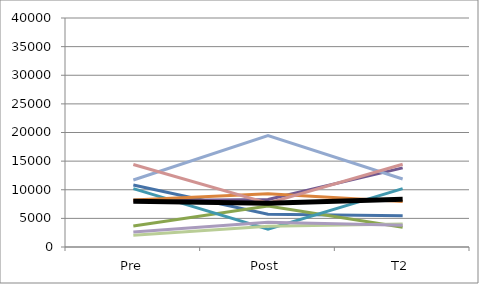
| Category | Series 0 | Series 1 | Series 2 | Series 3 | Series 4 | Series 5 | Series 6 | Series 7 | Series 8 | Series 9 | Mean |
|---|---|---|---|---|---|---|---|---|---|---|---|
| Pre | 10830 |  | 3655 | 8084 | 10206 | 8196 | 11697 | 14401 | 2067 | 2605 | 7971.222 |
| Post | 5720 |  | 7156 | 8305 | 3098 | 9307 | 19460 | 7662 | 3615 | 4324 | 7627.444 |
| T2 | 5441 |  | 3463 | 13826 | 10206 | 7947 | 11873 | 14458 | 4017 | 3814 | 8338.333 |